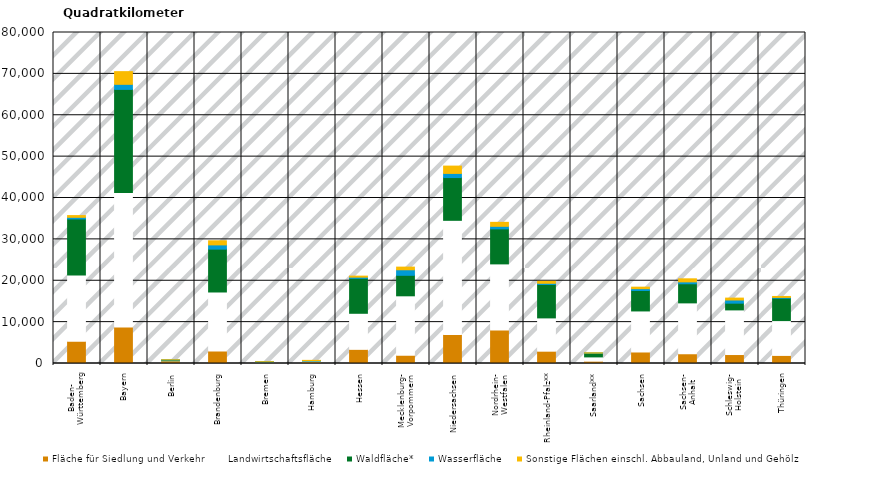
| Category | Fläche für Siedlung und Verkehr | Landwirtschaftsfläche | Waldfläche* | Wasserfläche | Sonstige Flächen einschl. Abbauland, Unland und Gehölz |
|---|---|---|---|---|---|
| Baden-
Württemberg | 5368.13 | 16038.05 | 13531.34 | 394.01 | 416.32 |
| Bayern | 8813.95 | 32507.92 | 24928.66 | 1222.73 | 3068.32 |
| Berlin | 629.17 | 35.42 | 157.8 | 58.46 | 10.27 |
| Brandenburg | 3050 | 14233.23 | 10360.96 | 1023.07 | 987.12 |
| Bremen | 238.53 | 113.95 | 4.36 | 48.39 | 14.71 |
| Hamburg | 441.82 | 172.65 | 42.62 | 62.16 | 35.84 |
| Hessen | 3418.68 | 8716.98 | 8444.4 | 289.62 | 245.94 |
| Mecklenburg-
Vorpommern | 2004.57 | 14355.92 | 4955.54 | 1337.53 | 640.34 |
| Niedersachsen | 7009.63 | 27593.21 | 10337.5 | 1002.78 | 1766.78 |
| Nordrhein-
Westfalen | 8124 | 15950.91 | 8464.03 | 616.4 | 957.37 |
| Rheinland-Pfalz** | 2975.91 | 8045.41 | 8079.89 | 286.81 | 469.95 |
| Saarland** | 562.94 | 1032.26 | 895.15 | 26.5 | 54.66 |
| Sachsen | 2782.12 | 9920.24 | 4941.21 | 442.95 | 363.34 |
| Sachsen-
Anhalt | 2364.8 | 12286.71 | 4620.48 | 457.96 | 737.25 |
| Schleswig-
Holstein | 2166.13 | 10787.85 | 1625.46 | 767.85 | 457.01 |
| Thüringen | 1952.44 | 8416.48 | 5405.65 | 193.25 | 234.55 |